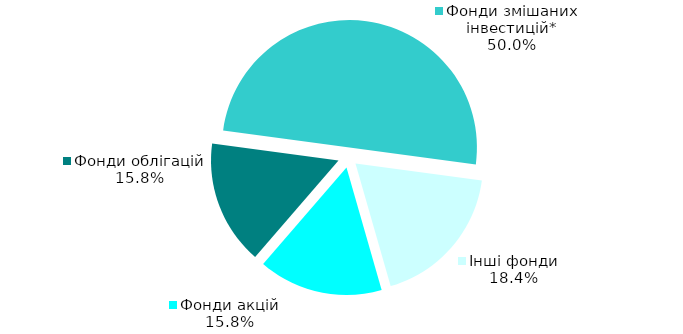
| Category | Series 0 |
|---|---|
| Фонди акцій | 6 |
| Фонди облігацій | 6 |
| Фонди змішаних інвестицій* | 19 |
| Інші фонди | 7 |